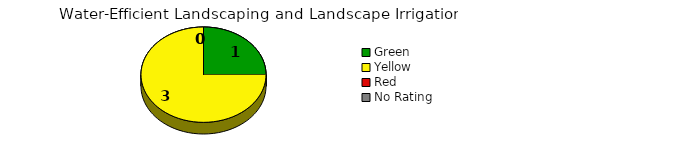
| Category | Counts |
|---|---|
| Green | 1 |
| Yellow | 3 |
| Red | 0 |
| No Rating | 0 |